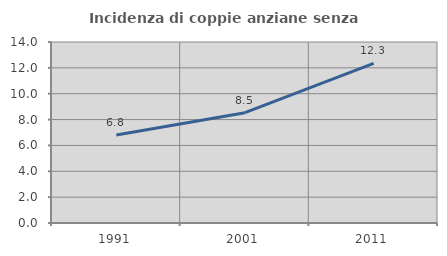
| Category | Incidenza di coppie anziane senza figli  |
|---|---|
| 1991.0 | 6.805 |
| 2001.0 | 8.534 |
| 2011.0 | 12.345 |